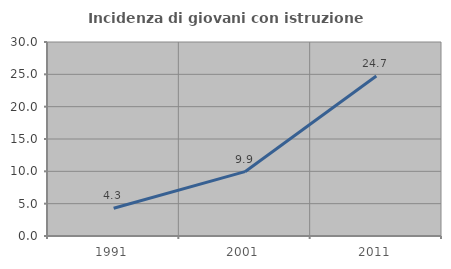
| Category | Incidenza di giovani con istruzione universitaria |
|---|---|
| 1991.0 | 4.289 |
| 2001.0 | 9.949 |
| 2011.0 | 24.748 |